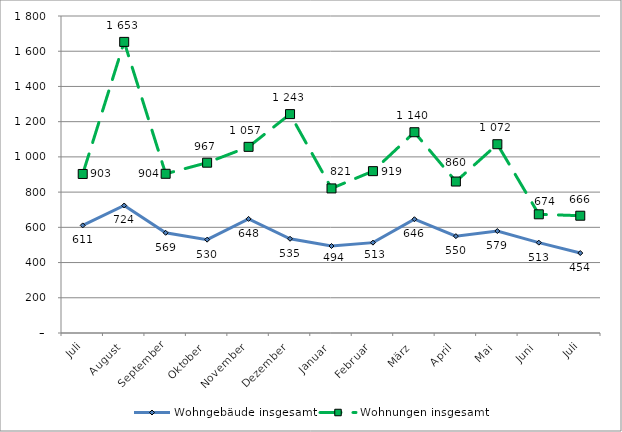
| Category | Wohngebäude insgesamt | Wohnungen insgesamt |
|---|---|---|
| Juli | 611 | 903 |
| August | 724 | 1653 |
| September | 569 | 904 |
| Oktober | 530 | 967 |
| November | 648 | 1057 |
| Dezember | 535 | 1243 |
| Januar | 494 | 821 |
| Februar | 513 | 919 |
| März | 646 | 1140 |
| April | 550 | 860 |
| Mai | 579 | 1072 |
| Juni | 513 | 674 |
| Juli | 454 | 666 |